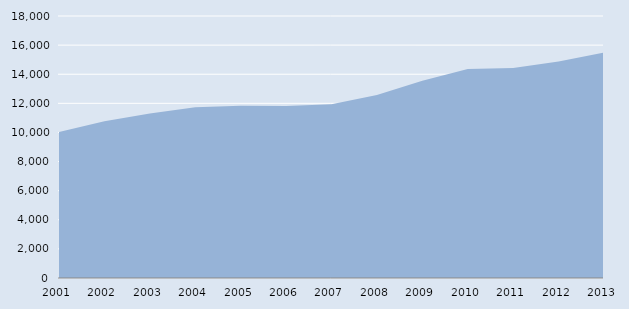
| Category | Series 0 |
|---|---|
| 2001.0 | 10030 |
| 2002.0 | 10762 |
| 2003.0 | 11300 |
| 2004.0 | 11729 |
| 2005.0 | 11833 |
| 2006.0 | 11823 |
| 2007.0 | 11940 |
| 2008.0 | 12569 |
| 2009.0 | 13553 |
| 2010.0 | 14356 |
| 2011.0 | 14430 |
| 2012.0 | 14868 |
| 2013.0 | 15486 |